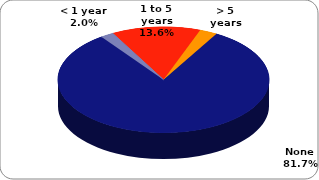
| Category | Series 0 |
|---|---|
| None | 0.817 |
| < 1 year | 0.02 |
| 1 to 5 years | 0.136 |
| > 5 years | 0.027 |